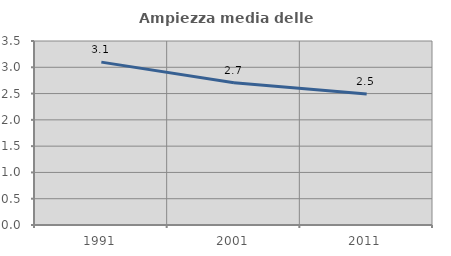
| Category | Ampiezza media delle famiglie |
|---|---|
| 1991.0 | 3.098 |
| 2001.0 | 2.704 |
| 2011.0 | 2.492 |